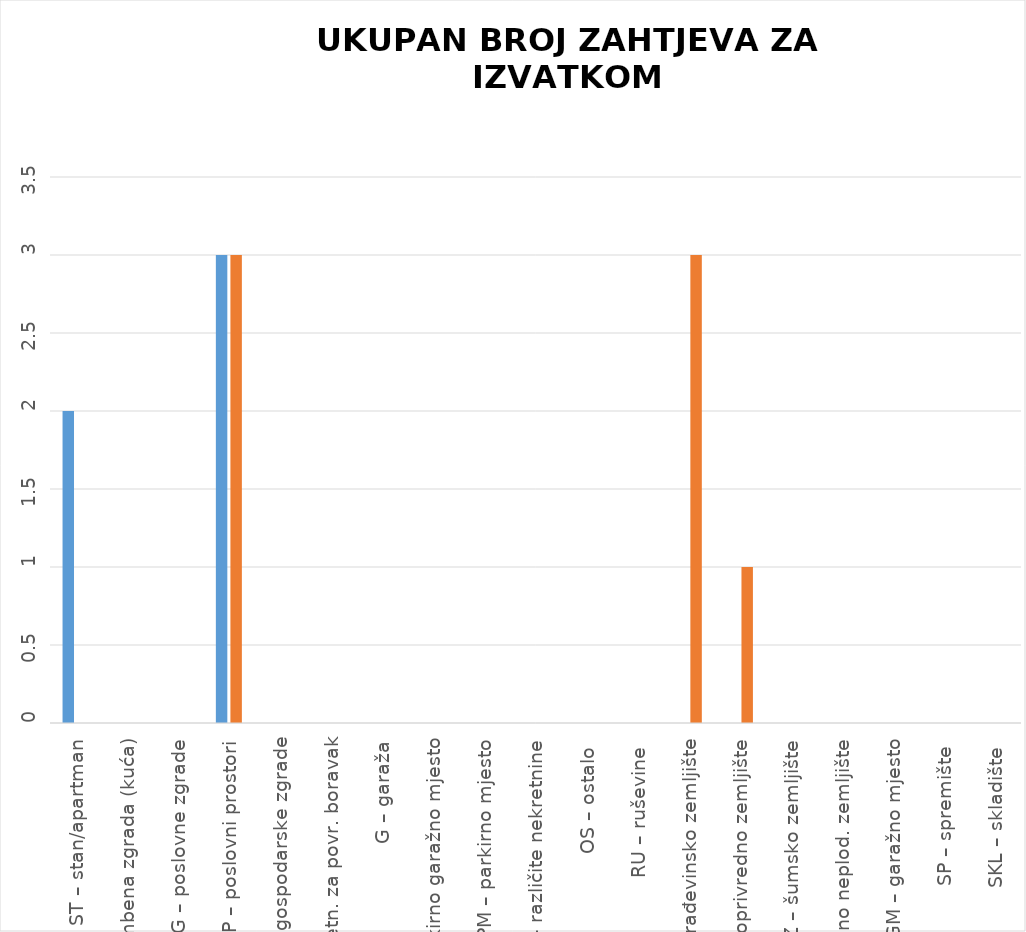
| Category | BROJ ZAPRIMLJENIH ZAHTJEVA KROZ APLIKACIJU eNekretnine | BROJ ZAPRIMLJENIH ZAHTJEVA IZVAN APLIKACIJE
(Popunjava službenik) |
|---|---|---|
| ST – stan/apartman | 2 | 0 |
| OK – stambena zgrada (kuća) | 0 | 0 |
| PZG – poslovne zgrade | 0 | 0 |
| PP – poslovni prostori | 3 | 3 |
| GZG – gospodarske zgrade | 0 | 0 |
| VIK – nekretn. za povr. boravak | 0 | 0 |
| G – garaža | 0 | 0 |
| PGM – parkirno garažno mjesto | 0 | 0 |
| VPM – parkirno mjesto | 0 | 0 |
| RN – različite nekretnine | 0 | 0 |
| OS – ostalo  | 0 | 0 |
| RU – ruševine  | 0 | 0 |
| GZ – građevinsko zemljište | 0 | 3 |
| PZ – poljoprivredno zemljište | 0 | 1 |
| ŠZ – šumsko zemljište | 0 | 0 |
| PNZ – prirodno neplod. zemljište | 0 | 0 |
| GM – garažno mjesto | 0 | 0 |
| SP – spremište  | 0 | 0 |
| SKL – skladište  | 0 | 0 |